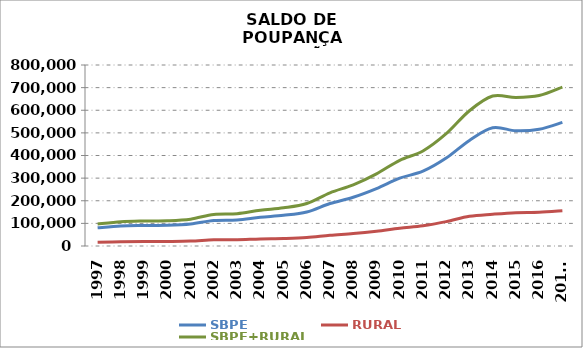
| Category | SBPE | RURAL | SBPE+RURAL |
|---|---|---|---|
| 1997 | 80250.377 | 16813.562 | 97063.939 |
| 1998 | 88538.349 | 18883.24 | 107421.589 |
| 1999 | 90437.74 | 20294.123 | 110731.863 |
| 2000 | 91430.45 | 20310.891 | 111741.341 |
| 2001 | 97146.25 | 21552.598 | 118698.848 |
| 2002 | 112423.444 | 27219.068 | 139642.512 |
| 2003 | 115258.021 | 27799.406 | 143057.427 |
| 2004 | 126853.217 | 31413.354 | 158266.571 |
| 2005 | 135411.681 | 33322.74 | 168734.421 |
| 2006 | 150412.546 | 37523.193 | 187935.739 |
| 2007 | 187827.264 | 47434.388 | 235261.652 |
| 2008 | 215400.282 | 54995.458 | 270395.74 |
| 2009 | 253604.98 | 65477.998 | 319082.978 |
| 2010 | 299878.217 | 78920.574 | 378798.791 |
| 2011 | 330569.272 | 89439.722 | 420008.994 |
| 2012 | 388641.662 | 107660.772 | 496302.434 |
| 2013 | 466788.644 | 131154.416 | 597943.06 |
| 2014 | 522343.501 | 140383.609 | 662727.11 |
| 2015 | 509223.044 | 147366.727 | 656589.771 |
| 2016 | 515955.43 | 149036.994 | 664992.424 |
| 2017* | 546487.327 | 155786.297 | 702273.624 |